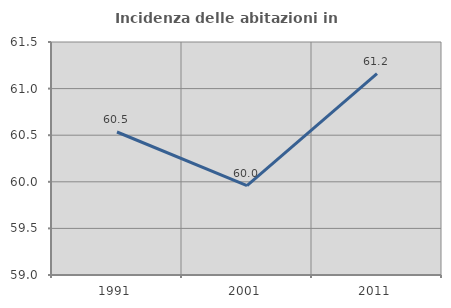
| Category | Incidenza delle abitazioni in proprietà  |
|---|---|
| 1991.0 | 60.534 |
| 2001.0 | 59.958 |
| 2011.0 | 61.16 |